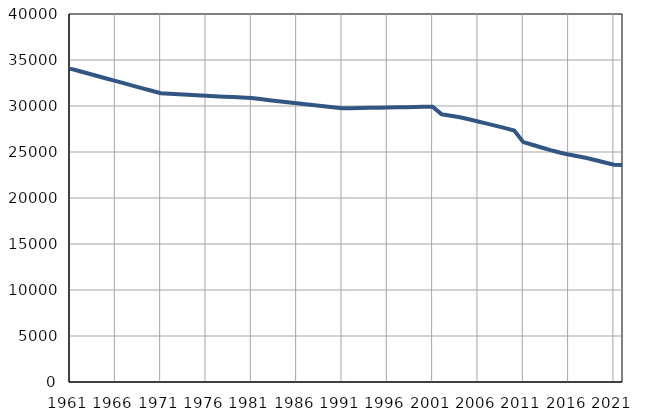
| Category | Број
становника |
|---|---|
| 1961.0 | 34067 |
| 1962.0 | 33799 |
| 1963.0 | 33531 |
| 1964.0 | 33263 |
| 1965.0 | 32995 |
| 1966.0 | 32727 |
| 1967.0 | 32459 |
| 1968.0 | 32191 |
| 1969.0 | 31923 |
| 1970.0 | 31655 |
| 1971.0 | 31387 |
| 1972.0 | 31334 |
| 1973.0 | 31282 |
| 1974.0 | 31229 |
| 1975.0 | 31176 |
| 1976.0 | 31124 |
| 1977.0 | 31071 |
| 1978.0 | 31018 |
| 1979.0 | 30965 |
| 1980.0 | 30913 |
| 1981.0 | 30860 |
| 1982.0 | 30749 |
| 1983.0 | 30637 |
| 1984.0 | 30526 |
| 1985.0 | 30415 |
| 1986.0 | 30304 |
| 1987.0 | 30192 |
| 1988.0 | 30081 |
| 1989.0 | 29970 |
| 1990.0 | 29857 |
| 1991.0 | 29747 |
| 1992.0 | 29765 |
| 1993.0 | 29783 |
| 1994.0 | 29802 |
| 1995.0 | 29820 |
| 1996.0 | 29838 |
| 1997.0 | 29856 |
| 1998.0 | 29874 |
| 1999.0 | 29892 |
| 2000.0 | 29911 |
| 2001.0 | 29929 |
| 2002.0 | 29093 |
| 2003.0 | 28934 |
| 2004.0 | 28776 |
| 2005.0 | 28556 |
| 2006.0 | 28315 |
| 2007.0 | 28081 |
| 2008.0 | 27835 |
| 2009.0 | 27590 |
| 2010.0 | 27342 |
| 2011.0 | 26074 |
| 2012.0 | 25793 |
| 2013.0 | 25491 |
| 2014.0 | 25205 |
| 2015.0 | 24947 |
| 2016.0 | 24719 |
| 2017.0 | 24539 |
| 2018.0 | 24345 |
| 2019.0 | 24107 |
| 2020.0 | 23859 |
| 2021.0 | 23613 |
| 2022.0 | 23594 |